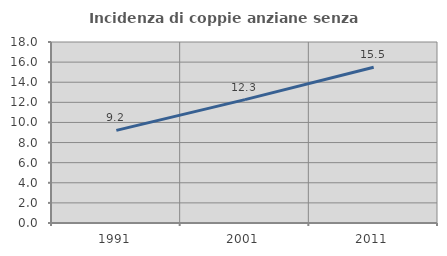
| Category | Incidenza di coppie anziane senza figli  |
|---|---|
| 1991.0 | 9.212 |
| 2001.0 | 12.267 |
| 2011.0 | 15.49 |